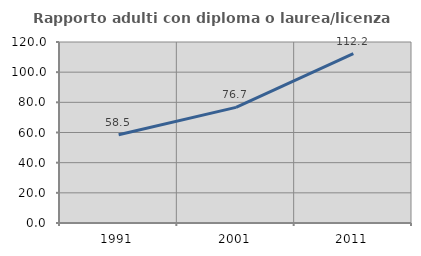
| Category | Rapporto adulti con diploma o laurea/licenza media  |
|---|---|
| 1991.0 | 58.545 |
| 2001.0 | 76.682 |
| 2011.0 | 112.218 |